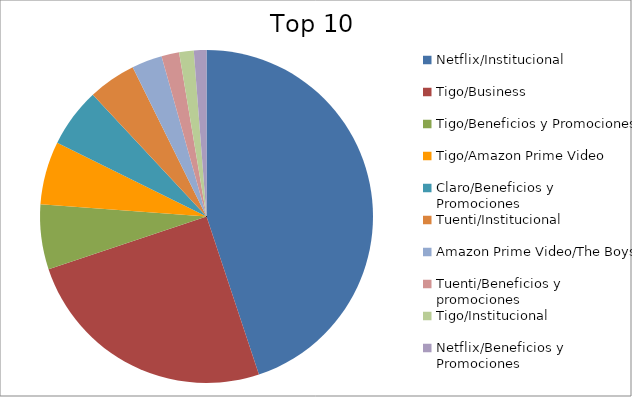
| Category | Series 0 |
|---|---|
| Netflix/Institucional | 43.44 |
| Tigo/Business | 24.16 |
| Tigo/Beneficios y Promociones | 6.08 |
| Tigo/Amazon Prime Video | 5.94 |
| Claro/Beneficios y Promociones | 5.55 |
| Tuenti/Institucional | 4.5 |
| Amazon Prime Video/The Boys | 2.86 |
| Tuenti/Beneficios y promociones | 1.66 |
| Tigo/Institucional | 1.37 |
| Netflix/Beneficios y Promociones | 1.18 |